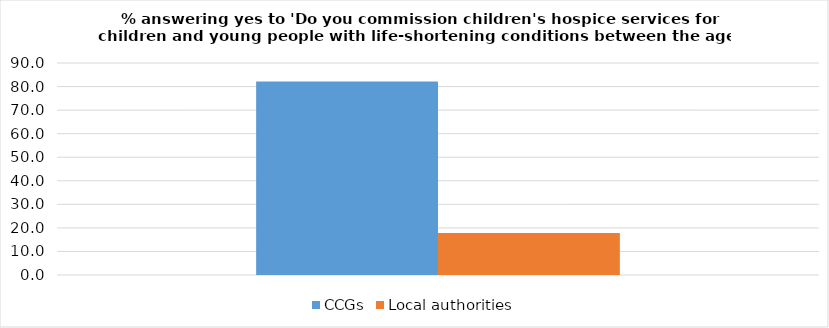
| Category | CCGs | Local authorities |
|---|---|---|
| 0 | 82.123 | 17.8 |